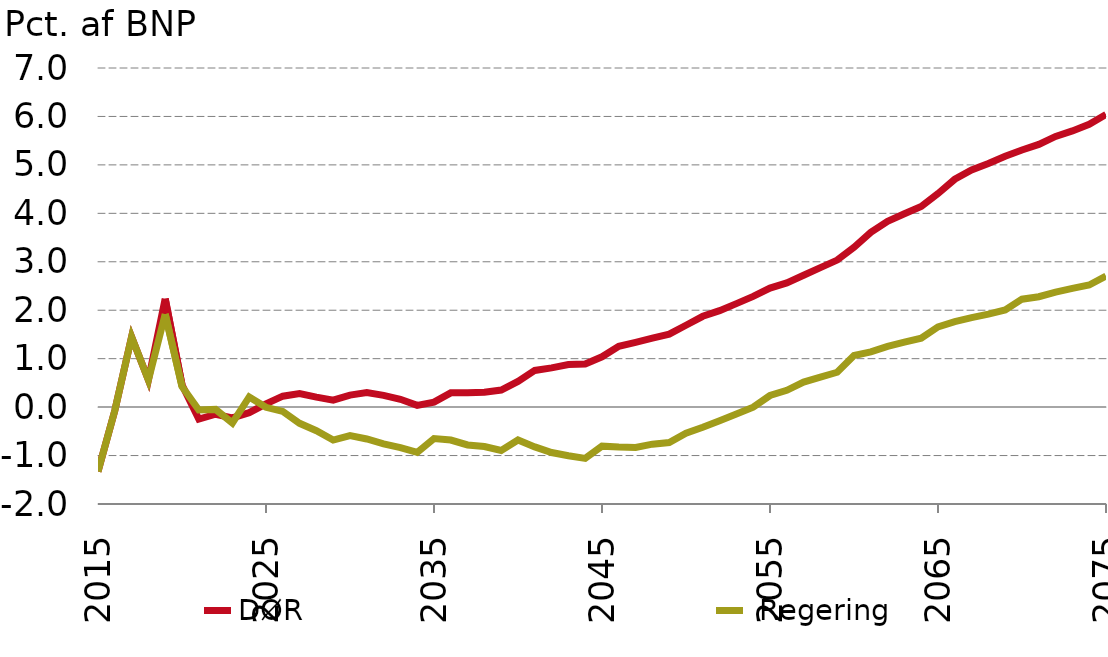
| Category | nullinje | DØR |  Regering |
|---|---|---|---|
| 2015-01-01 | 0 | -1.33 | -1.33 |
| 2016-01-01 | 0 | -0.073 | -0.073 |
| 2017-01-01 | 0 | 1.45 | 1.45 |
| 2018-01-01 | 0 | 0.559 | 0.559 |
| 2019-01-01 | 0 | 2.237 | 1.92 |
| 2020-01-01 | 0 | 0.461 | 0.425 |
| 2021-01-01 | 0 | -0.245 | -0.058 |
| 2022-01-01 | 0 | -0.147 | -0.047 |
| 2023-01-01 | 0 | -0.222 | -0.328 |
| 2024-01-01 | 0 | -0.116 | 0.21 |
| 2025-01-01 | 0 | 0.066 | -0.005 |
| 2026-01-01 | 0 | 0.225 | -0.089 |
| 2027-01-01 | 0 | 0.278 | -0.335 |
| 2028-01-01 | 0 | 0.206 | -0.487 |
| 2029-01-01 | 0 | 0.143 | -0.681 |
| 2030-01-01 | 0 | 0.248 | -0.589 |
| 2031-01-01 | 0 | 0.299 | -0.658 |
| 2032-01-01 | 0 | 0.242 | -0.758 |
| 2033-01-01 | 0 | 0.161 | -0.835 |
| 2034-01-01 | 0 | 0.036 | -0.935 |
| 2035-01-01 | 0 | 0.103 | -0.648 |
| 2036-01-01 | 0 | 0.295 | -0.68 |
| 2037-01-01 | 0 | 0.296 | -0.781 |
| 2038-01-01 | 0 | 0.308 | -0.814 |
| 2039-01-01 | 0 | 0.352 | -0.894 |
| 2040-01-01 | 0 | 0.532 | -0.678 |
| 2041-01-01 | 0 | 0.757 | -0.821 |
| 2042-01-01 | 0 | 0.809 | -0.938 |
| 2043-01-01 | 0 | 0.878 | -1.005 |
| 2044-01-01 | 0 | 0.89 | -1.058 |
| 2045-01-01 | 0 | 1.038 | -0.806 |
| 2046-01-01 | 0 | 1.256 | -0.825 |
| 2047-01-01 | 0 | 1.337 | -0.831 |
| 2048-01-01 | 0 | 1.426 | -0.765 |
| 2049-01-01 | 0 | 1.506 | -0.732 |
| 2050-01-01 | 0 | 1.69 | -0.539 |
| 2051-01-01 | 0 | 1.874 | -0.415 |
| 2052-01-01 | 0 | 1.991 | -0.281 |
| 2053-01-01 | 0 | 2.136 | -0.143 |
| 2054-01-01 | 0 | 2.286 | -0.001 |
| 2055-01-01 | 0 | 2.458 | 0.239 |
| 2056-01-01 | 0 | 2.564 | 0.347 |
| 2057-01-01 | 0 | 2.721 | 0.516 |
| 2058-01-01 | 0 | 2.879 | 0.619 |
| 2059-01-01 | 0 | 3.035 | 0.72 |
| 2060-01-01 | 0 | 3.297 | 1.066 |
| 2061-01-01 | 0 | 3.607 | 1.14 |
| 2062-01-01 | 0 | 3.835 | 1.252 |
| 2063-01-01 | 0 | 3.99 | 1.341 |
| 2064-01-01 | 0 | 4.139 | 1.424 |
| 2065-01-01 | 0 | 4.407 | 1.656 |
| 2066-01-01 | 0 | 4.704 | 1.763 |
| 2067-01-01 | 0 | 4.895 | 1.848 |
| 2068-01-01 | 0 | 5.028 | 1.92 |
| 2069-01-01 | 0 | 5.177 | 2.006 |
| 2070-01-01 | 0 | 5.308 | 2.228 |
| 2071-01-01 | 0 | 5.423 | 2.279 |
| 2072-01-01 | 0 | 5.588 | 2.372 |
| 2073-01-01 | 0 | 5.701 | 2.451 |
| 2074-01-01 | 0 | 5.838 | 2.521 |
| 2075-01-01 | 0 | 6.041 | 2.707 |